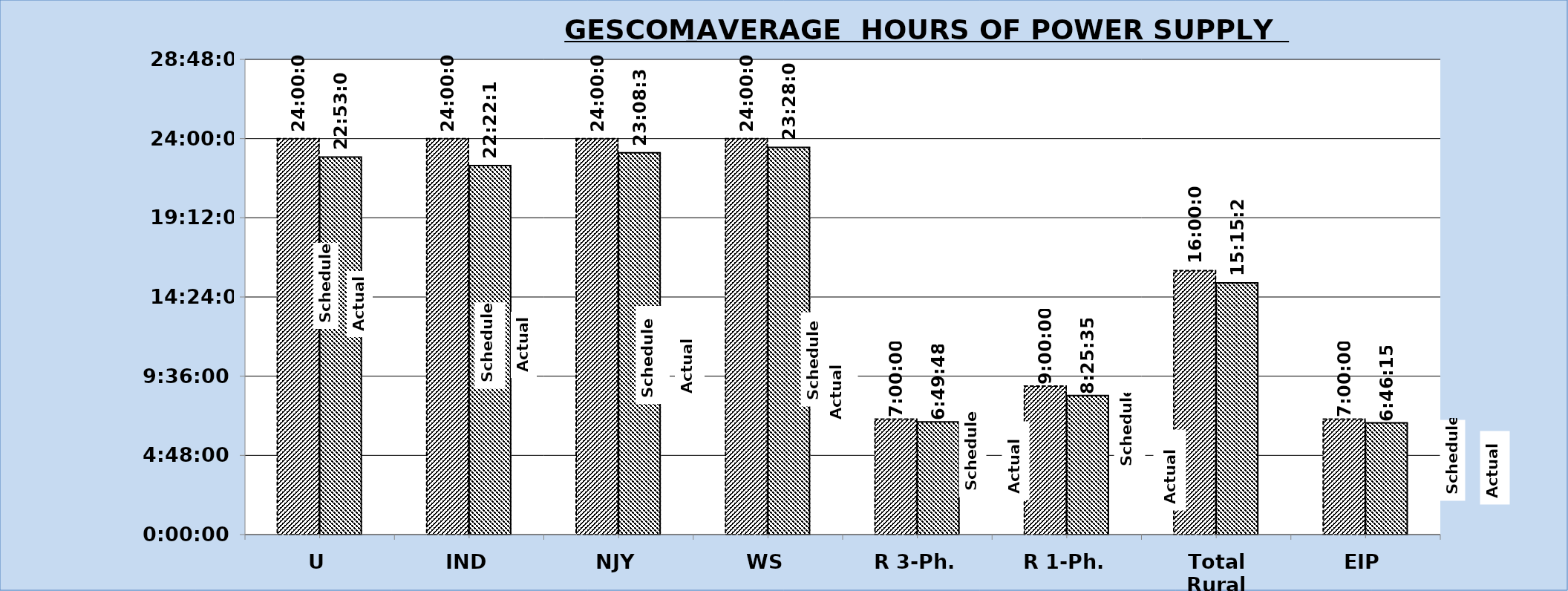
| Category |  Schedule Hours of Power Supply | GESCOM |
|---|---|---|
| U | 1900-01-01 | 0.954 |
| IND | 1900-01-01 | 0.932 |
| NJY | 1900-01-01 | 0.964 |
| WS | 1900-01-01 | 0.978 |
| R 3-Ph. | 0.292 | 0.285 |
| R 1-Ph. | 0.375 | 0.351 |
| Total Rural | 0.667 | 0.636 |
| EIP | 0.292 | 0.282 |